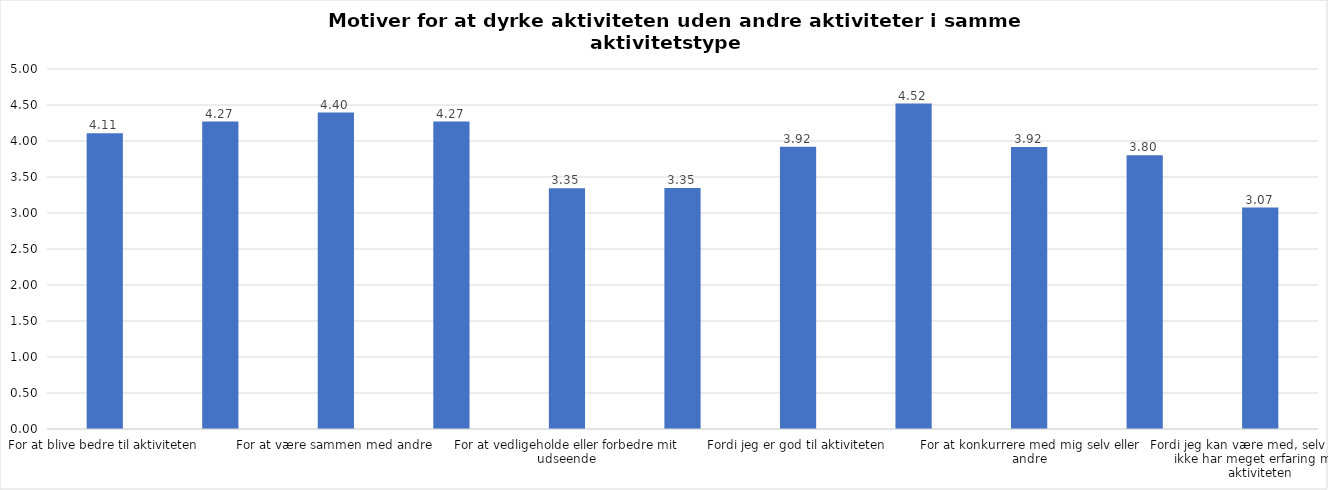
| Category | Gennemsnit |
|---|---|
| For at blive bedre til aktiviteten | 4.107 |
| For at vedligeholde eller forbedre min sundhed (fx helbred, fysisk form) | 4.27 |
| For at være sammen med andre | 4.395 |
| For at gøre noget godt for mig selv | 4.27 |
| For at vedligeholde eller forbedre mit udseende | 3.345 |
| Fordi andre i min omgangskreds opmuntrer mig til det | 3.349 |
| Fordi jeg er god til aktiviteten | 3.922 |
| Fordi jeg godt kan lide aktiviteten | 4.52 |
| For at konkurrere med mig selv eller andre | 3.918 |
| Fordi aktiviteten passer godt ind i min hverdag | 3.801 |
| Fordi jeg kan være med, selv om jeg ikke har meget erfaring med aktiviteten | 3.075 |